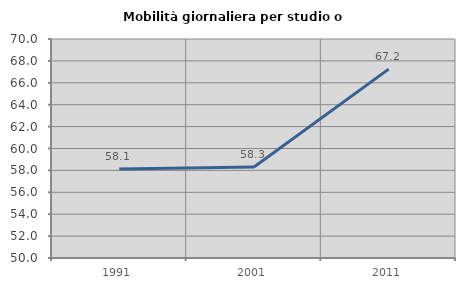
| Category | Mobilità giornaliera per studio o lavoro |
|---|---|
| 1991.0 | 58.125 |
| 2001.0 | 58.317 |
| 2011.0 | 67.247 |